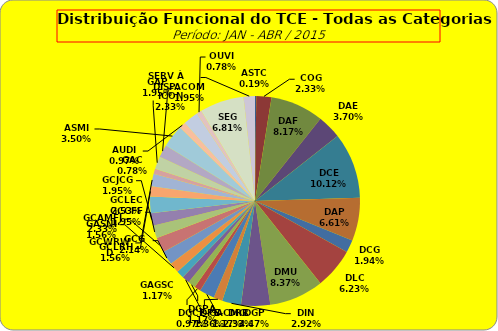
| Category | ASTC COG DAF DAE DCE DAP DCG DLC DMU DGP DIN DPE DRR DGCE DGPA GACMG GAGSC GASNI GCG GCAMFJ GCCFF GCJCG GCLEC GCLRH GCWRWD GAC GAP ACOM ASMI AUDI ICON OUVI SEG SERV À DISP. |
|---|---|
| ASTC | 1 |
| COG | 12 |
| DAF | 42 |
| DAE | 19 |
| DCE | 52 |
| DAP | 34 |
| DCG | 10 |
| DLC | 32 |
| DMU | 43 |
| DGP | 23 |
| DIN | 15 |
| DPE | 7 |
| DRR | 12 |
| DGCE | 5 |
| DGPA | 6 |
| GACMG | 6 |
| GAGSC | 6 |
| GASNI | 8 |
| GCG | 11 |
| GCAMFJ | 12 |
| GCCFF | 10 |
| GCJCG | 10 |
| GCLEC | 13 |
| GCLRH | 8 |
| GCWRWD | 10 |
| GAC | 4 |
| GAP | 10 |
| ACOM | 10 |
| ASMI | 18 |
| AUDI | 5 |
| ICON | 12 |
| OUVI | 4 |
| SEG | 35 |
| SERV À DISP. | 9 |